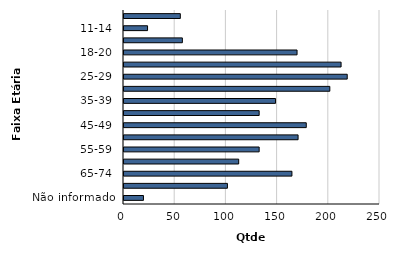
| Category | Qtde Vítimas |
|---|---|
| Não informado | 19 |
| 75+ | 101 |
| 65-74 | 164 |
| 60-64 | 112 |
| 55-59 | 132 |
| 50-54 | 170 |
| 45-49 | 178 |
| 40-44 | 132 |
| 35-39 | 148 |
| 30-34 | 201 |
| 25-29 | 218 |
| 21-24 | 212 |
| 18-20 | 169 |
| 15-17 | 57 |
| 11-14 | 23 |
| 0-10 | 55 |